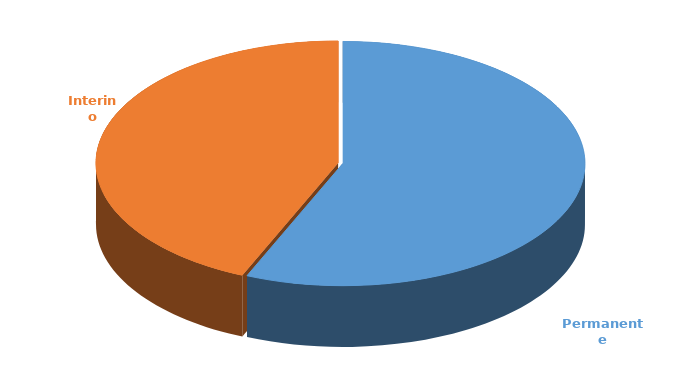
| Category | Cantidad |
|---|---|
| Permanente | 3219 |
| Interino | 2481 |